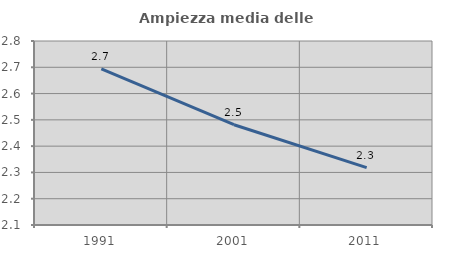
| Category | Ampiezza media delle famiglie |
|---|---|
| 1991.0 | 2.694 |
| 2001.0 | 2.481 |
| 2011.0 | 2.318 |